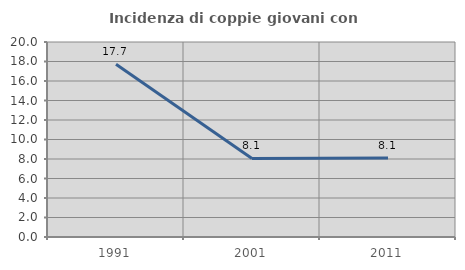
| Category | Incidenza di coppie giovani con figli |
|---|---|
| 1991.0 | 17.711 |
| 2001.0 | 8.056 |
| 2011.0 | 8.092 |